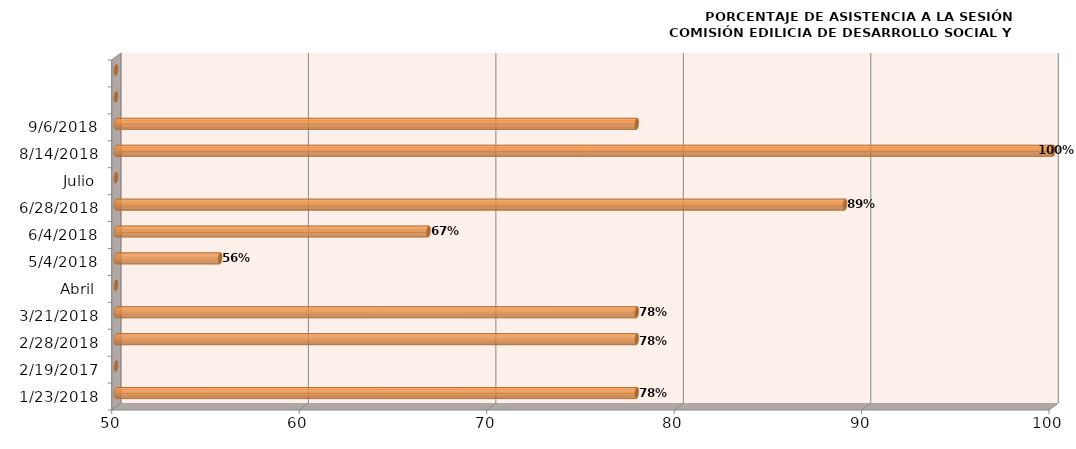
| Category | Series 0 |
|---|---|
| 23/01/2018 | 77.778 |
| 19/02/2017 | 0 |
| 28/02/2018 | 77.778 |
| 21/03/2018 | 77.778 |
| Abril | 0 |
| 04/05/2018 | 55.556 |
| 04/06/2018 | 66.667 |
| 28/06/2018 | 88.889 |
| Julio | 0 |
| 14/08/2018 | 100 |
| 06/09/2018 | 77.778 |